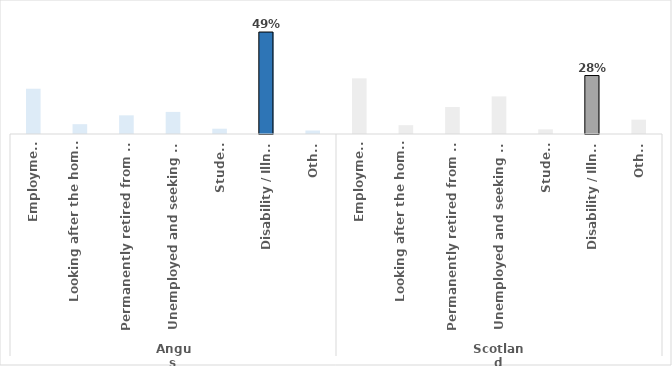
| Category | Series 0 |
|---|---|
| 0 | 0.219 |
| 1 | 0.047 |
| 2 | 0.09 |
| 3 | 0.107 |
| 4 | 0.026 |
| 5 | 0.493 |
| 6 | 0.017 |
| 7 | 0.269 |
| 8 | 0.043 |
| 9 | 0.131 |
| 10 | 0.182 |
| 11 | 0.023 |
| 12 | 0.283 |
| 13 | 0.069 |